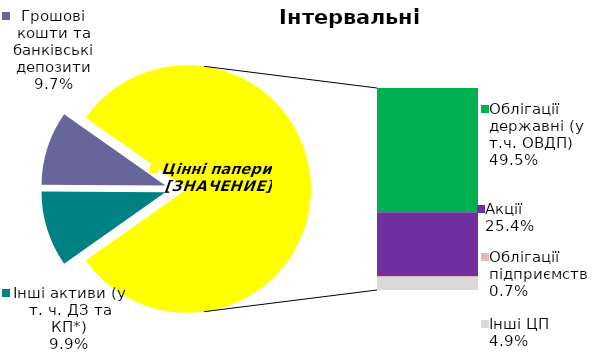
| Category | Series 0 |
|---|---|
| Інші активи (у т. ч. ДЗ та КП*) | 0.099 |
| Грошові кошти та банківські депозити | 0.097 |
| Банківські метали | 0 |
| Облігації державні (у т.ч. ОВДП) | 0.495 |
| Облігації місцевих позик | 0 |
| Акції | 0.254 |
| Облігації підприємств | 0.007 |
| Інші ЦП  | 0.049 |